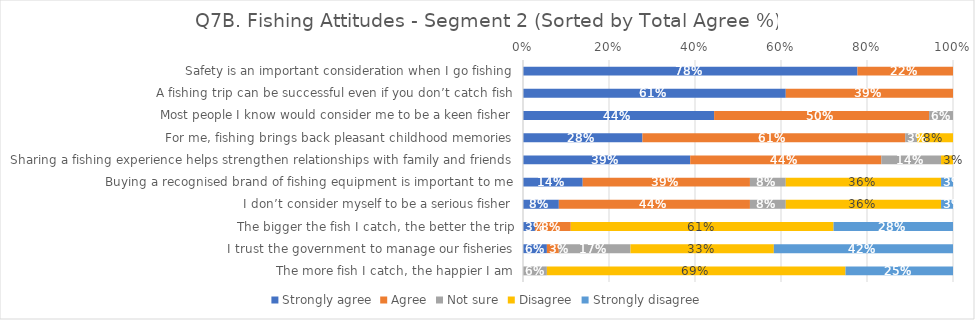
| Category | Strongly agree | Agree | Not sure | Disagree | Strongly disagree |
|---|---|---|---|---|---|
| Safety is an important consideration when I go fishing | 0.778 | 0.222 | 0 | 0 | 0 |
| A fishing trip can be successful even if you don’t catch fish | 0.611 | 0.389 | 0 | 0 | 0 |
| Most people I know would consider me to be a keen fisher | 0.444 | 0.5 | 0.056 | 0 | 0 |
| For me, fishing brings back pleasant childhood memories | 0.278 | 0.611 | 0.028 | 0.083 | 0 |
| Sharing a fishing experience helps strengthen relationships with family and friends | 0.389 | 0.444 | 0.139 | 0.028 | 0 |
| Buying a recognised brand of fishing equipment is important to me | 0.139 | 0.389 | 0.083 | 0.361 | 0.028 |
| I don’t consider myself to be a serious fisher | 0.083 | 0.444 | 0.083 | 0.361 | 0.028 |
| The bigger the fish I catch, the better the trip | 0.028 | 0.083 | 0 | 0.611 | 0.278 |
| I trust the government to manage our fisheries | 0.056 | 0.028 | 0.167 | 0.333 | 0.417 |
| The more fish I catch, the happier I am | 0 | 0 | 0.056 | 0.694 | 0.25 |